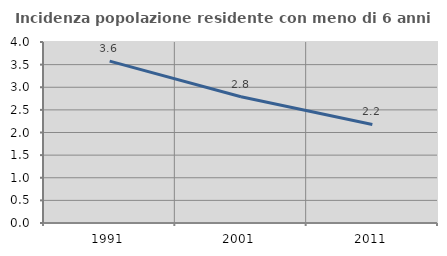
| Category | Incidenza popolazione residente con meno di 6 anni |
|---|---|
| 1991.0 | 3.578 |
| 2001.0 | 2.789 |
| 2011.0 | 2.178 |